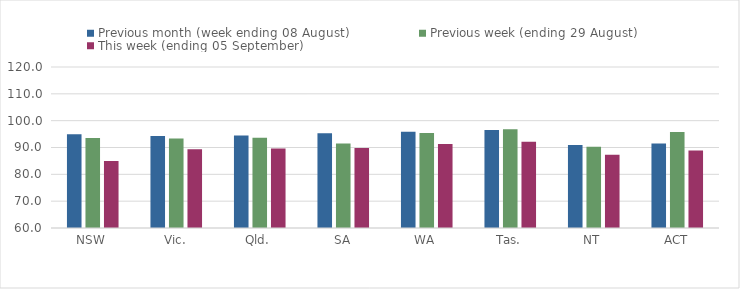
| Category | Previous month (week ending 08 August) | Previous week (ending 29 August) | This week (ending 05 September) |
|---|---|---|---|
| NSW | 94.9 | 93.55 | 85.01 |
| Vic. | 94.3 | 93.4 | 89.31 |
| Qld. | 94.44 | 93.59 | 89.61 |
| SA | 95.29 | 91.49 | 89.79 |
| WA | 95.85 | 95.36 | 91.3 |
| Tas. | 96.53 | 96.83 | 92.18 |
| NT | 90.91 | 90.25 | 87.28 |
| ACT | 91.52 | 95.81 | 88.86 |